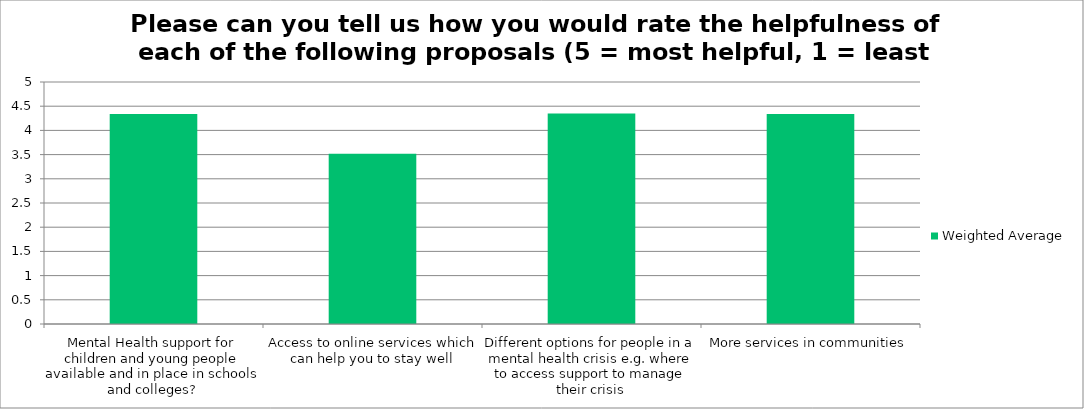
| Category | Weighted Average |
|---|---|
| Mental Health support for children and young people available and in place in schools and colleges? | 4.34 |
| Access to online services which can help you to stay well | 3.52 |
| Different options for people in a mental health crisis e.g. where to access support to manage their crisis | 4.35 |
| More services in communities | 4.34 |